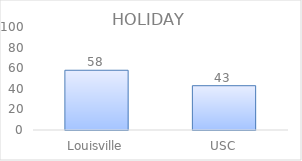
| Category | Series 0 |
|---|---|
| Louisville | 58 |
| USC | 43 |